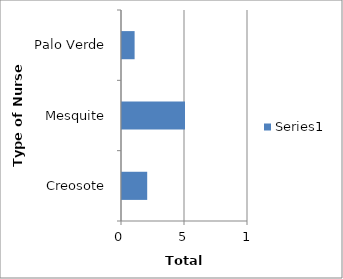
| Category | Series 0 |
|---|---|
| Creosote | 2 |
| Mesquite | 5 |
| Palo Verde | 1 |